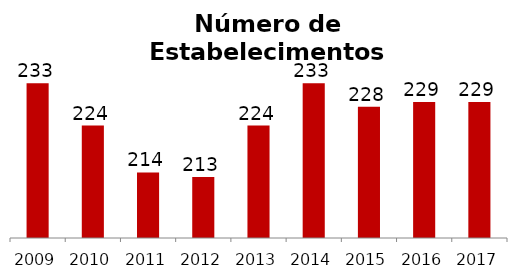
| Category | Cultura e Lazer |
|---|---|
| 2009.0 | 233 |
| 2010.0 | 224 |
| 2011.0 | 214 |
| 2012.0 | 213 |
| 2013.0 | 224 |
| 2014.0 | 233 |
| 2015.0 | 228 |
| 2016.0 | 229 |
| 2017.0 | 229 |